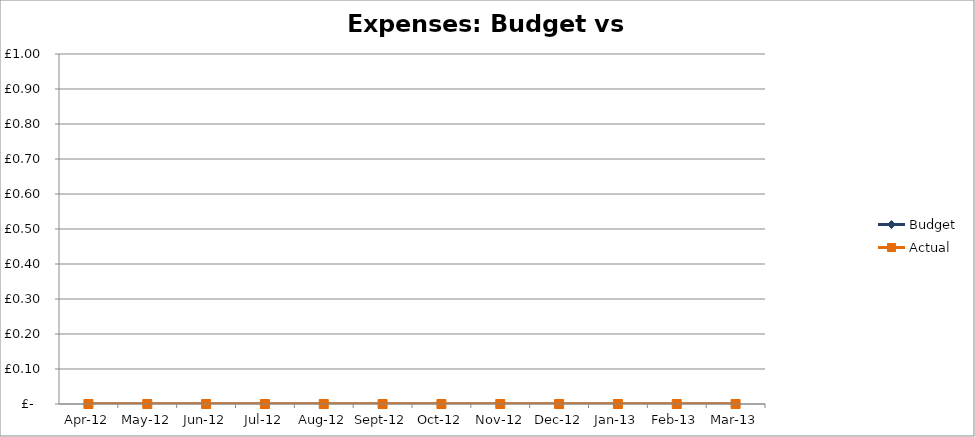
| Category | Budget | Actual |
|---|---|---|
| 2012-04-01 | 0 | 0 |
| 2012-05-01 | 0 | 0 |
| 2012-06-01 | 0 | 0 |
| 2012-07-01 | 0 | 0 |
| 2012-08-01 | 0 | 0 |
| 2012-09-01 | 0 | 0 |
| 2012-10-01 | 0 | 0 |
| 2012-11-01 | 0 | 0 |
| 2012-12-01 | 0 | 0 |
| 2013-01-01 | 0 | 0 |
| 2013-02-01 | 0 | 0 |
| 2013-03-01 | 0 | 0 |